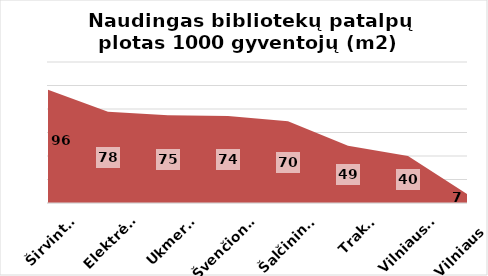
| Category | Series 0 |
|---|---|
| Širvintos | 96.308 |
| Elektrėnai | 77.719 |
| Ukmergė | 74.677 |
| Švenčionys | 73.953 |
| Šalčininkai | 69.561 |
| Trakai | 48.748 |
| Vilniaus r. | 40.075 |
| Vilniaus m. | 7.16 |